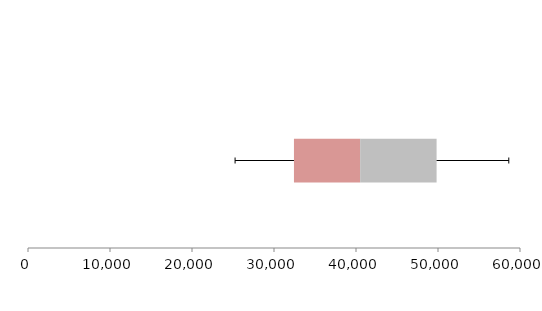
| Category | Series 1 | Series 2 | Series 3 |
|---|---|---|---|
| 0 | 32433.519 | 8074.164 | 9320.908 |